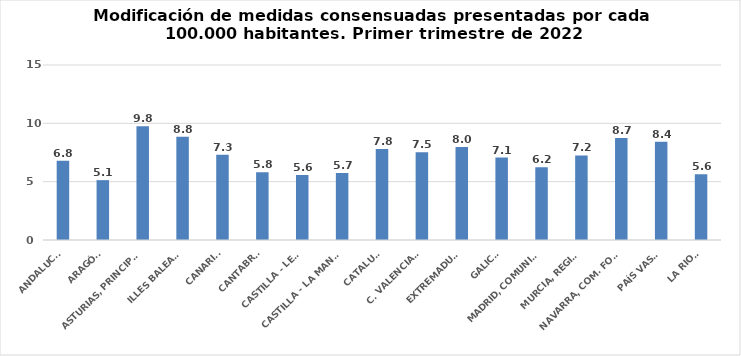
| Category | Series 0 |
|---|---|
| ANDALUCÍA | 6.8 |
| ARAGÓN | 5.131 |
| ASTURIAS, PRINCIPADO | 9.756 |
| ILLES BALEARS | 8.842 |
| CANARIAS | 7.306 |
| CANTABRIA | 5.81 |
| CASTILLA - LEÓN | 5.569 |
| CASTILLA - LA MANCHA | 5.75 |
| CATALUÑA | 7.799 |
| C. VALENCIANA | 7.523 |
| EXTREMADURA | 7.968 |
| GALICIA | 7.065 |
| MADRID, COMUNIDAD | 6.227 |
| MURCIA, REGIÓN | 7.248 |
| NAVARRA, COM. FORAL | 8.74 |
| PAÍS VASCO | 8.427 |
| LA RIOJA | 5.634 |